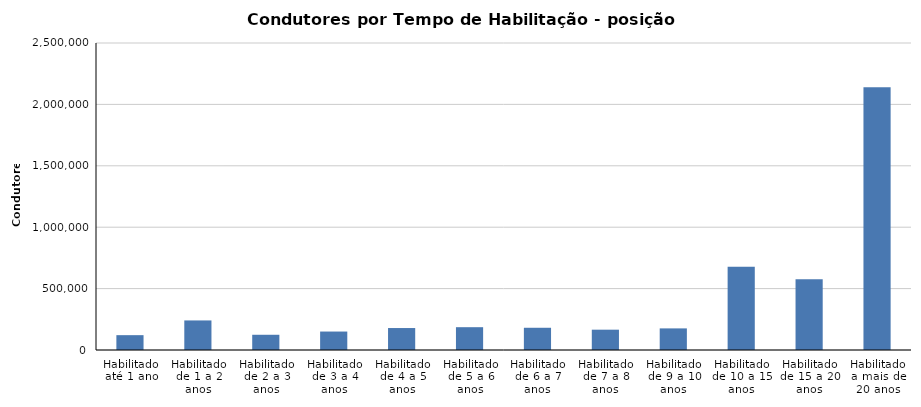
| Category | 2019/Dezembro |
|---|---|
| Habilitado até 1 ano | 120858 |
| Habilitado de 1 a 2 anos | 240760 |
| Habilitado de 2 a 3 anos | 124008 |
| Habilitado de 3 a 4 anos | 150286 |
| Habilitado de 4 a 5 anos | 178835 |
| Habilitado de 5 a 6 anos | 185741 |
| Habilitado de 6 a 7 anos | 181064 |
| Habilitado de 7 a 8 anos | 165459 |
| Habilitado de 9 a 10 anos | 175984 |
| Habilitado de 10 a 15 anos | 678209 |
| Habilitado de 15 a 20 anos | 575329 |
| Habilitado a mais de 20 anos | 2139945 |